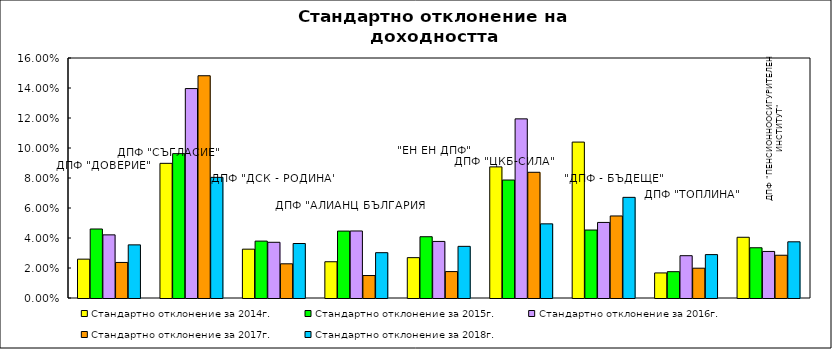
| Category | Стандартно отклонение за 2014г. | Стандартно отклонение за 2015г. | Стандартно отклонение за 2016г. | Стандартно отклонение за 2017г. | Стандартно отклонение за 2018г. |
|---|---|---|---|---|---|
| ДПФ "ДОВЕРИЕ"  | 0.026 | 0.046 | 0.042 | 0.024 | 0.035 |
| ДПФ "СЪГЛАСИЕ"  | 0.09 | 0.096 | 0.14 | 0.148 | 0.08 |
| ДПФ "ДСК - РОДИНА" | 0.033 | 0.038 | 0.037 | 0.023 | 0.036 |
| ДПФ "АЛИАНЦ БЪЛГАРИЯ" | 0.024 | 0.045 | 0.045 | 0.015 | 0.03 |
| "ЕН ЕН ДПФ" | 0.027 | 0.041 | 0.038 | 0.018 | 0.034 |
| ДПФ "ЦКБ-СИЛА" | 0.087 | 0.079 | 0.119 | 0.084 | 0.049 |
| "ДПФ - БЪДЕЩЕ" | 0.104 | 0.045 | 0.05 | 0.055 | 0.067 |
| ДПФ "ТОПЛИНА" | 0.017 | 0.018 | 0.028 | 0.02 | 0.029 |
| ДПФ "ПЕНСИОННООСИГУРИТЕЛЕН ИНСТИТУТ" | 0.04 | 0.033 | 0.031 | 0.029 | 0.037 |